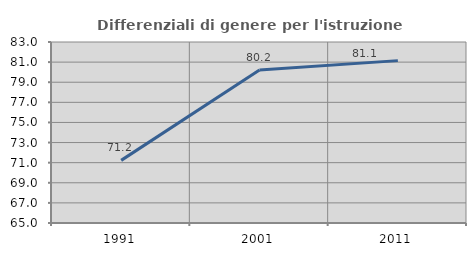
| Category | Differenziali di genere per l'istruzione superiore |
|---|---|
| 1991.0 | 71.228 |
| 2001.0 | 80.224 |
| 2011.0 | 81.148 |